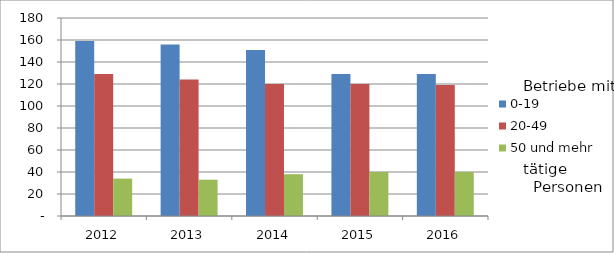
| Category | 0-19 | 20-49 | 50 und mehr |
|---|---|---|---|
| 2012.0 | 159 | 129 | 34 |
| 2013.0 | 156 | 124 | 33 |
| 2014.0 | 151 | 120 | 38 |
| 2015.0 | 129 | 120 | 40 |
| 2016.0 | 129 | 119 | 40 |